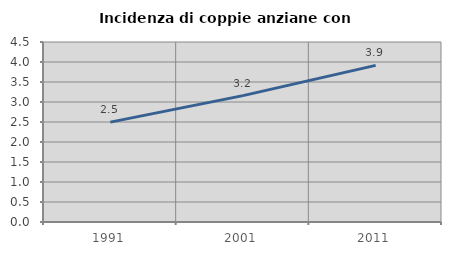
| Category | Incidenza di coppie anziane con figli |
|---|---|
| 1991.0 | 2.497 |
| 2001.0 | 3.16 |
| 2011.0 | 3.915 |